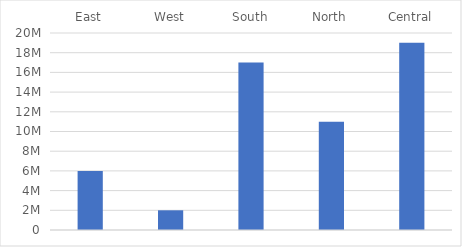
| Category | Met |
|---|---|
| East | 6000000 |
| West | 2000000 |
| South | 17000000 |
| North | 11000000 |
| Central | 19000000 |